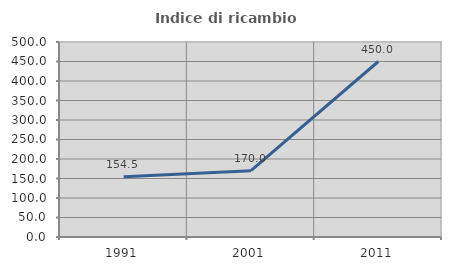
| Category | Indice di ricambio occupazionale  |
|---|---|
| 1991.0 | 154.545 |
| 2001.0 | 170 |
| 2011.0 | 450 |